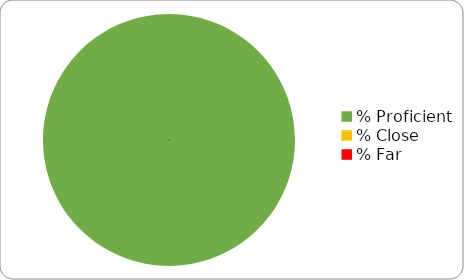
| Category | Series 0 |
|---|---|
| % Proficient | 1 |
| % Close | 0 |
| % Far | 0 |